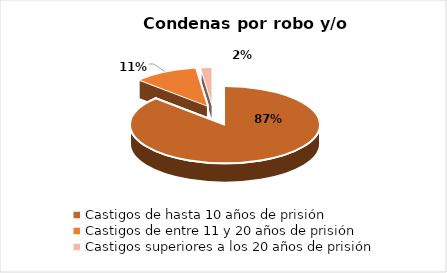
| Category | Series 0 |
|---|---|
| Castigos de hasta 10 años de prisión | 0.87 |
| Castigos de entre 11 y 20 años de prisión | 0.11 |
| Castigos superiores a los 20 años de prisión | 0.02 |